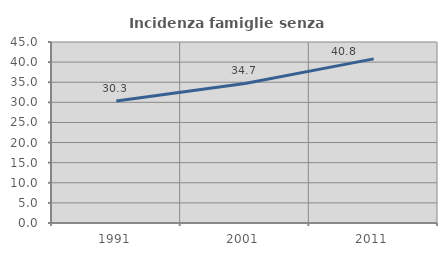
| Category | Incidenza famiglie senza nuclei |
|---|---|
| 1991.0 | 30.307 |
| 2001.0 | 34.688 |
| 2011.0 | 40.807 |